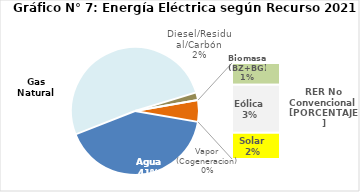
| Category | Series 0 |
|---|---|
| Agua | 1945.108 |
| Gas Natural | 2414.595 |
| Diesel/Residual/Carbón | 92.56 |
| Vapor (Cogeneracion) | 0.189 |
| Biomasa (BZ+BG) | 58.09 |
| Eólica | 128.811 |
| Solar | 70.789 |